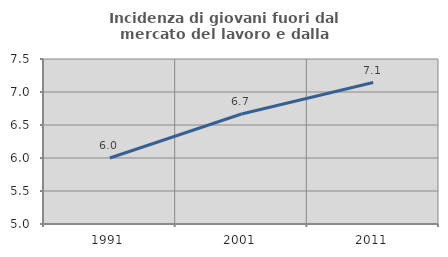
| Category | Incidenza di giovani fuori dal mercato del lavoro e dalla formazione  |
|---|---|
| 1991.0 | 6 |
| 2001.0 | 6.667 |
| 2011.0 | 7.143 |